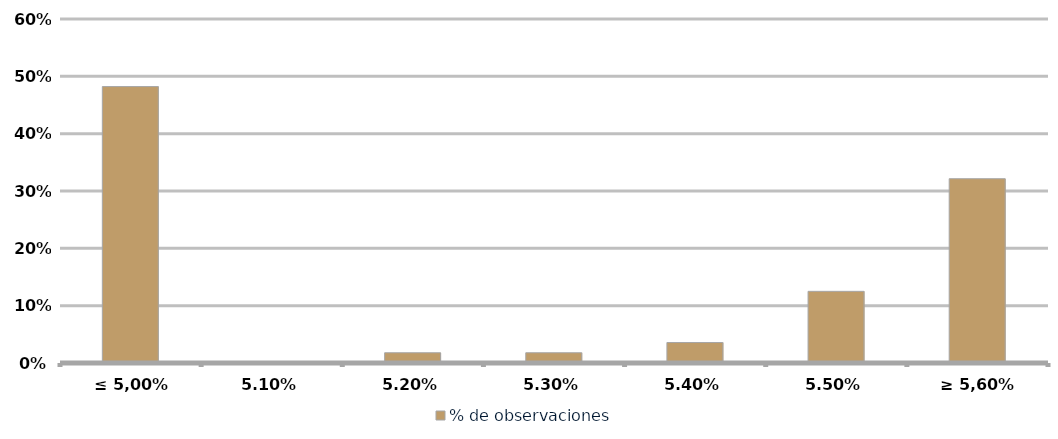
| Category | % de observaciones  |
|---|---|
| ≤ 5,00% | 0.482 |
| 5,10% | 0 |
| 5,20% | 0.018 |
| 5,30% | 0.018 |
| 5,40% | 0.036 |
| 5,50% | 0.125 |
| ≥ 5,60% | 0.321 |